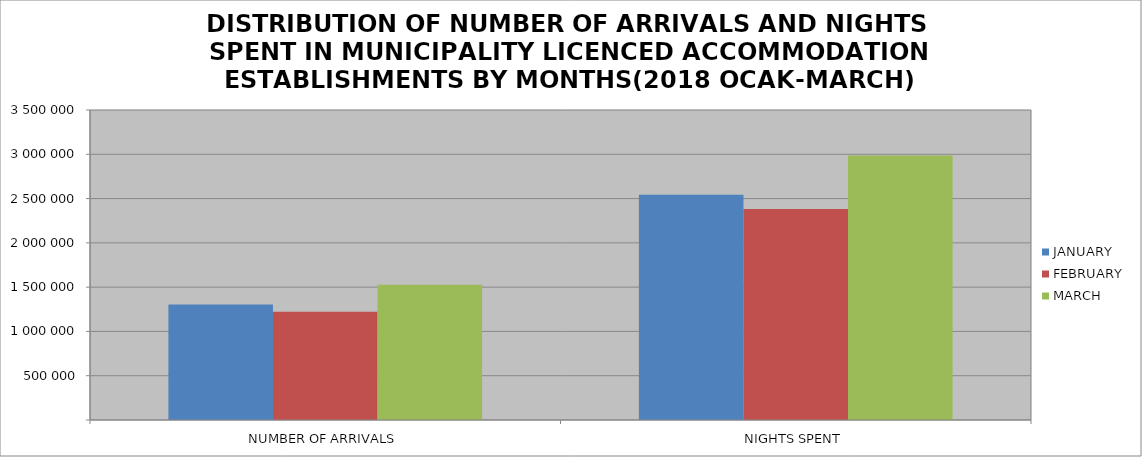
| Category | JANUARY | FEBRUARY | MARCH |
|---|---|---|---|
| NUMBER OF ARRIVALS | 1303353 | 1223475 | 1526172 |
| NIGHTS SPENT | 2542103 | 2381300 | 2986820 |